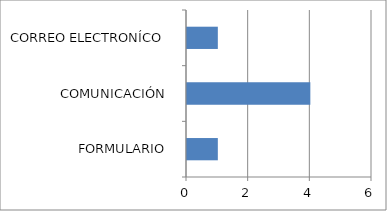
| Category | Series 0 |
|---|---|
| FORMULARIO  | 1 |
| COMUNICACIÓN  | 4 |
| CORREO ELECTRONÍCO  | 1 |